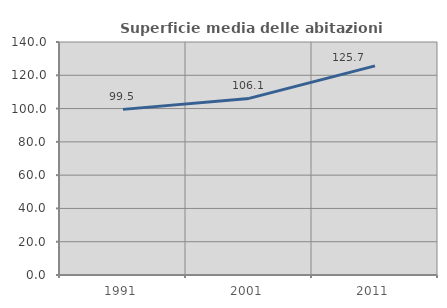
| Category | Superficie media delle abitazioni occupate |
|---|---|
| 1991.0 | 99.519 |
| 2001.0 | 106.102 |
| 2011.0 | 125.676 |